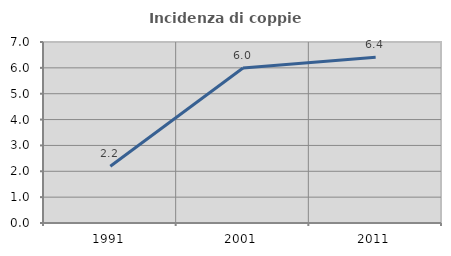
| Category | Incidenza di coppie miste |
|---|---|
| 1991.0 | 2.196 |
| 2001.0 | 5.994 |
| 2011.0 | 6.41 |